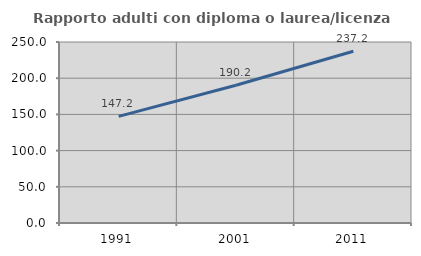
| Category | Rapporto adulti con diploma o laurea/licenza media  |
|---|---|
| 1991.0 | 147.222 |
| 2001.0 | 190.248 |
| 2011.0 | 237.172 |